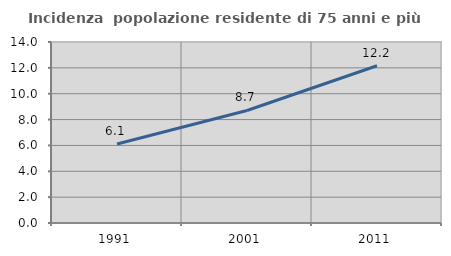
| Category | Incidenza  popolazione residente di 75 anni e più |
|---|---|
| 1991.0 | 6.113 |
| 2001.0 | 8.704 |
| 2011.0 | 12.162 |